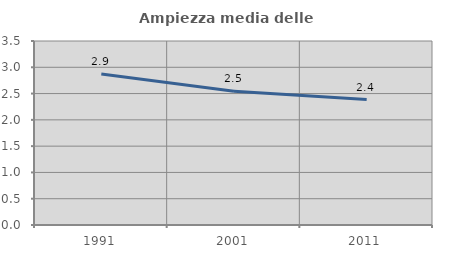
| Category | Ampiezza media delle famiglie |
|---|---|
| 1991.0 | 2.871 |
| 2001.0 | 2.544 |
| 2011.0 | 2.387 |